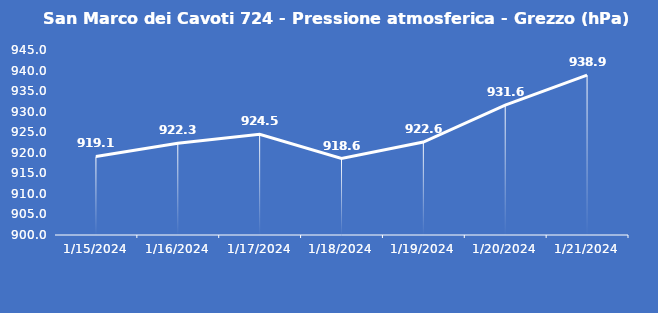
| Category | San Marco dei Cavoti 724 - Pressione atmosferica - Grezzo (hPa) |
|---|---|
| 1/15/24 | 919.1 |
| 1/16/24 | 922.3 |
| 1/17/24 | 924.5 |
| 1/18/24 | 918.6 |
| 1/19/24 | 922.6 |
| 1/20/24 | 931.6 |
| 1/21/24 | 938.9 |